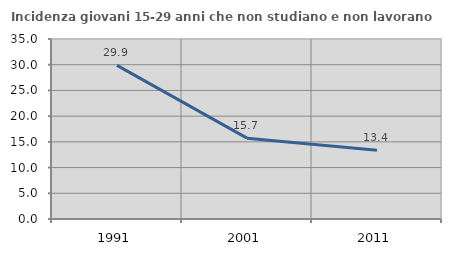
| Category | Incidenza giovani 15-29 anni che non studiano e non lavorano  |
|---|---|
| 1991.0 | 29.878 |
| 2001.0 | 15.723 |
| 2011.0 | 13.38 |